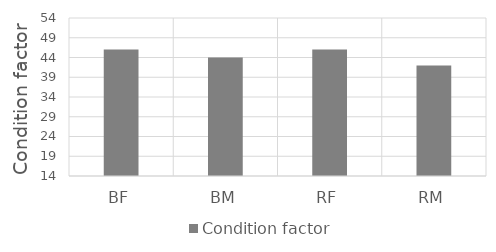
| Category | Condition factor |
|---|---|
| BF | 46 |
| BM | 44 |
| RF | 46 |
| RM | 42 |